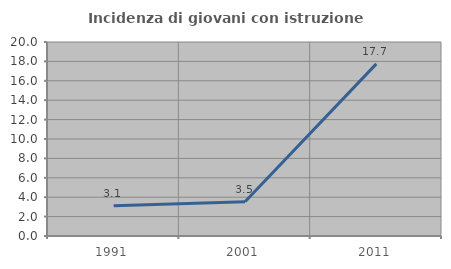
| Category | Incidenza di giovani con istruzione universitaria |
|---|---|
| 1991.0 | 3.125 |
| 2001.0 | 3.529 |
| 2011.0 | 17.742 |